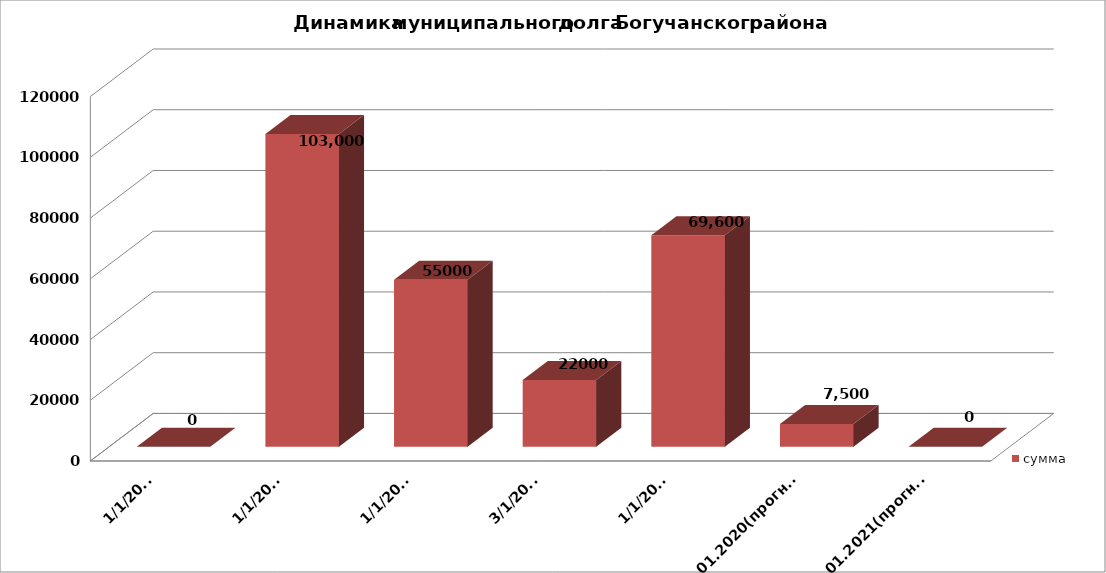
| Category | сумма |
|---|---|
| 01.01.2016 | 0 |
| 01.01.2017 | 103000 |
| 01.01.2018 | 55000 |
| 01.03.2018 | 22000 |
| 01.01.2019 | 69600 |
| 01.01.2020(прогноз) | 7500 |
| 01.01.2021(прогноз) | 0 |